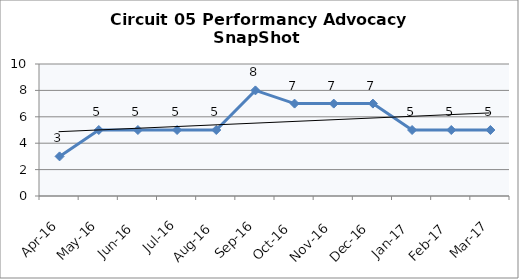
| Category | Circuit 05 |
|---|---|
| Apr-16 | 3 |
| May-16 | 5 |
| Jun-16 | 5 |
| Jul-16 | 5 |
| Aug-16 | 5 |
| Sep-16 | 8 |
| Oct-16 | 7 |
| Nov-16 | 7 |
| Dec-16 | 7 |
| Jan-17 | 5 |
| Feb-17 | 5 |
| Mar-17 | 5 |